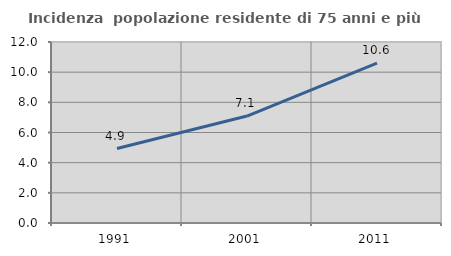
| Category | Incidenza  popolazione residente di 75 anni e più |
|---|---|
| 1991.0 | 4.935 |
| 2001.0 | 7.093 |
| 2011.0 | 10.592 |